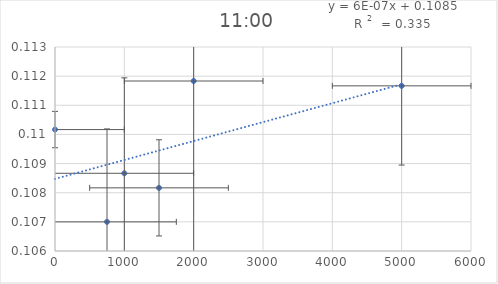
| Category | Series 0 |
|---|---|
| 750.0 | 0.107 |
| 1000.0 | 0.109 |
| 1500.0 | 0.108 |
| 2000.0 | 0.112 |
| 5000.0 | 0.112 |
| 0.0 | 0.11 |